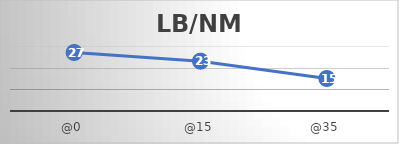
| Category | LB/NM |
|---|---|
| @0 | 27 |
| @15 | 23 |
| @35 | 15 |